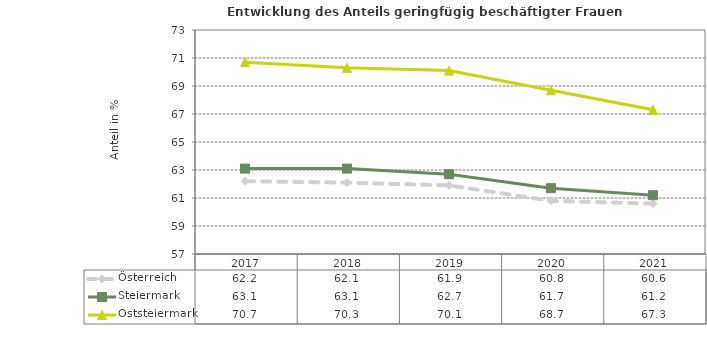
| Category | Österreich | Steiermark | Oststeiermark |
|---|---|---|---|
| 2021.0 | 60.6 | 61.2 | 67.3 |
| 2020.0 | 60.8 | 61.7 | 68.7 |
| 2019.0 | 61.9 | 62.7 | 70.1 |
| 2018.0 | 62.1 | 63.1 | 70.3 |
| 2017.0 | 62.2 | 63.1 | 70.7 |